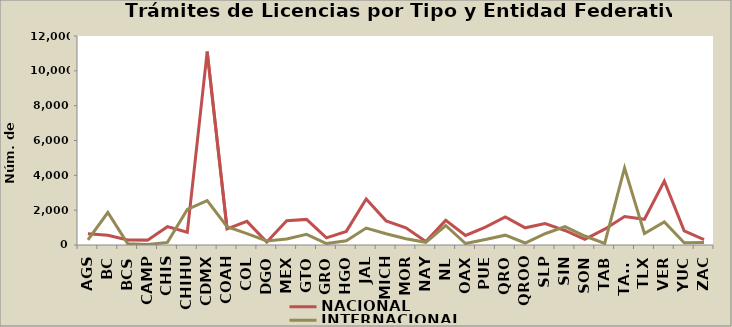
| Category | NACIONAL | INTERNACIONAL |
|---|---|---|
| AGS | 647 | 290 |
| BC | 554 | 1864 |
| BCS | 285 | 77 |
| CAMP | 280 | 23 |
| CHIS | 1054 | 151 |
| CHIHU | 732 | 2045 |
| CDMX | 11104 | 2546 |
| COAH | 930 | 1051 |
| COL | 1358 | 656 |
| DGO | 167 | 230 |
| MEX | 1391 | 346 |
| GTO | 1471 | 611 |
| GRO | 408 | 83 |
| HGO | 781 | 247 |
| JAL | 2638 | 975 |
| MICH | 1387 | 643 |
| MOR | 989 | 361 |
| NAY | 200 | 154 |
| NL | 1414 | 1119 |
| OAX | 547 | 84 |
| PUE | 1027 | 321 |
| QRO | 1616 | 565 |
| QROO | 988 | 115 |
| SLP | 1236 | 646 |
| SIN | 834 | 1056 |
| SON | 323 | 515 |
| TAB | 908 | 90 |
| TAMS | 1636 | 4423 |
| TLX | 1475 | 663 |
| VER | 3670 | 1328 |
| YUC | 809 | 132 |
| ZAC | 302 | 138 |